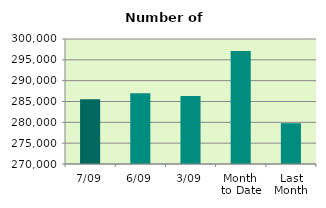
| Category | Series 0 |
|---|---|
| 7/09 | 285526 |
| 6/09 | 286988 |
| 3/09 | 286332 |
| Month 
to Date | 297116.4 |
| Last
Month | 279794.182 |